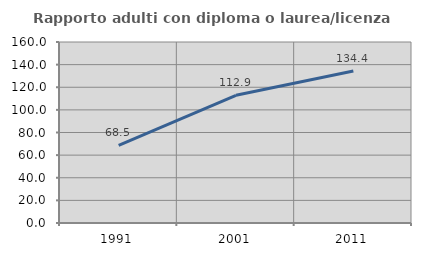
| Category | Rapporto adulti con diploma o laurea/licenza media  |
|---|---|
| 1991.0 | 68.538 |
| 2001.0 | 112.921 |
| 2011.0 | 134.395 |